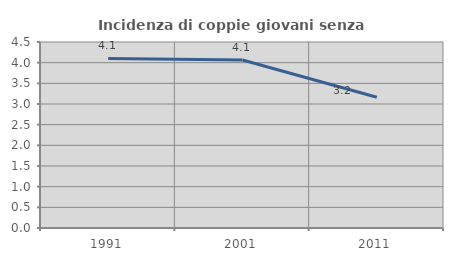
| Category | Incidenza di coppie giovani senza figli |
|---|---|
| 1991.0 | 4.102 |
| 2001.0 | 4.063 |
| 2011.0 | 3.164 |